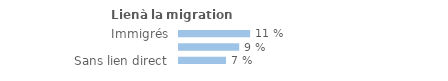
| Category | Series 0 |
|---|---|
| Immigrés | 0.107 |
| Descendants d'immigré(s) | 0.09 |
| Sans lien direct | 0.07 |